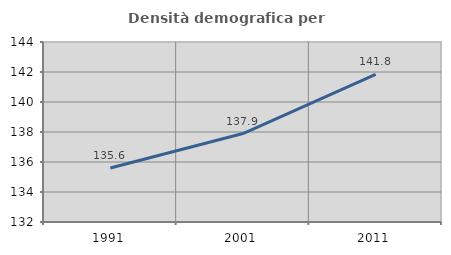
| Category | Densità demografica |
|---|---|
| 1991.0 | 135.597 |
| 2001.0 | 137.899 |
| 2011.0 | 141.834 |